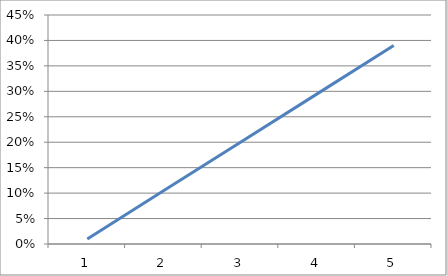
| Category | Series 0 |
|---|---|
| 0 | 0.01 |
| 1 | 0.105 |
| 2 | 0.2 |
| 3 | 0.295 |
| 4 | 0.39 |